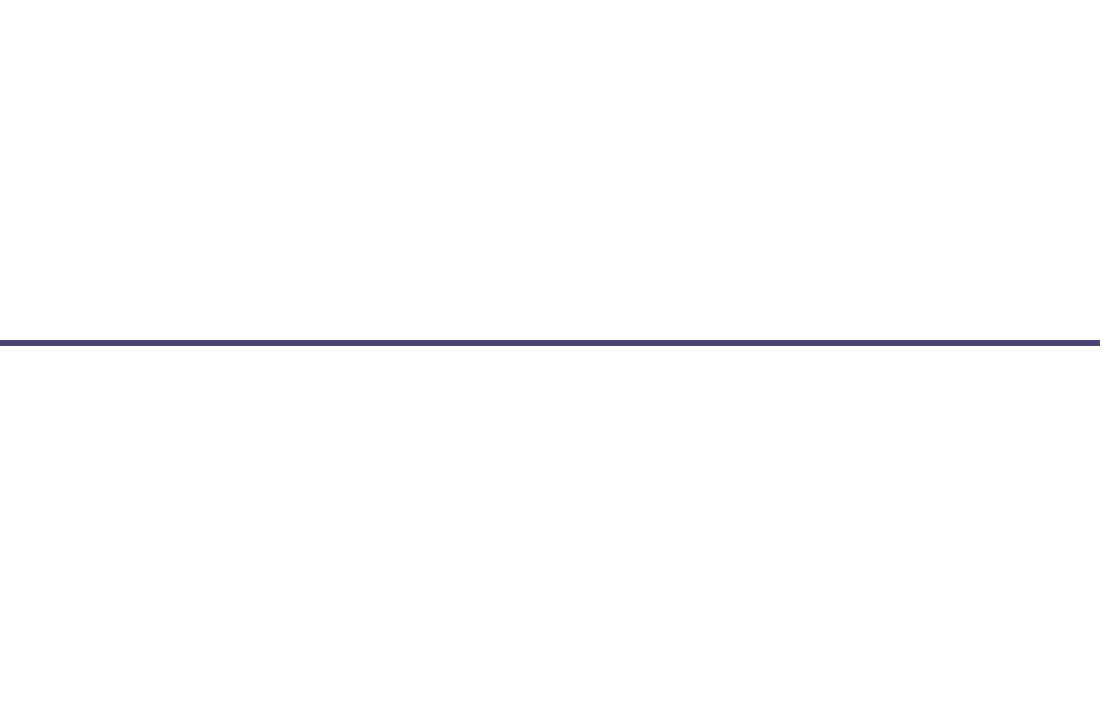
| Category | Позиция |
|---|---|
| 0 | 1 |
| 1 | -2 |
| 2 | 1 |
| 3 | -1 |
| 4 | -0.5 |
| 5 | 2 |
| 6 | 0.5 |
| 7 | -1 |
| 8 | 0.5 |
| 9 | -2 |